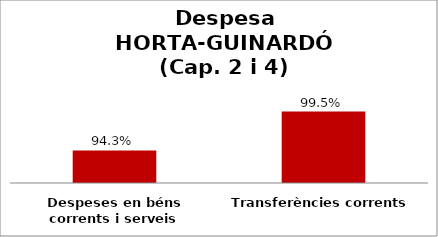
| Category | Series 0 |
|---|---|
| Despeses en béns corrents i serveis | 0.943 |
| Transferències corrents | 0.995 |